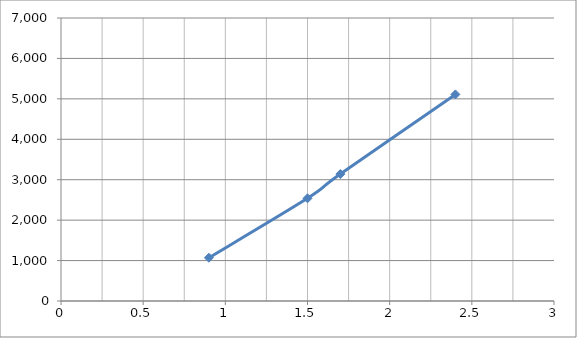
| Category | Series 0 |
|---|---|
| 0.9 | 1070 |
| 1.5 | 2540 |
| 1.7 | 3140 |
| 2.4 | 5110 |